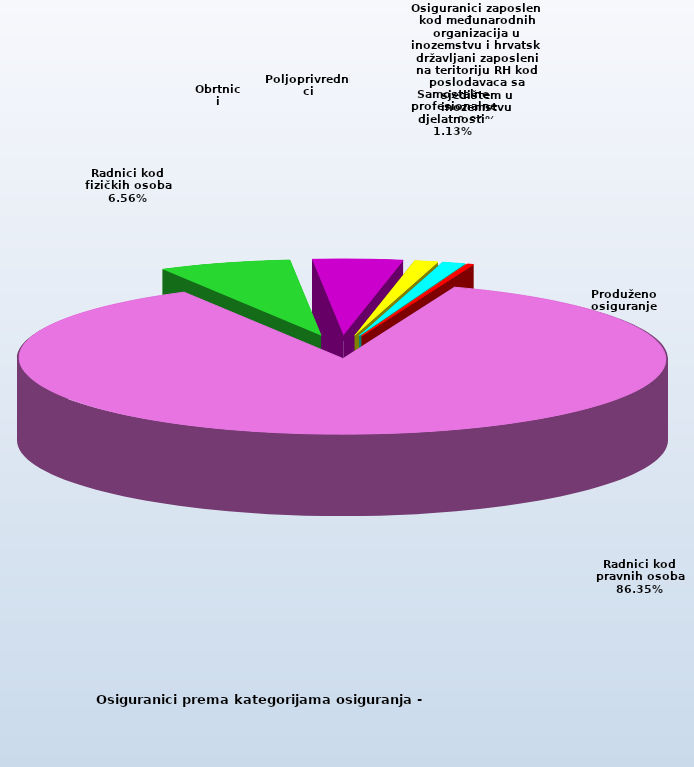
| Category | Series 0 |
|---|---|
| Radnici kod pravnih osoba | 1381245 |
| Radnici kod fizičkih osoba | 104935 |
| Obrtnici | 71474 |
| Poljoprivrednici | 18733 |
| Samostalne profesionalne djelatnosti  | 18115 |
| Osiguranici zaposleni kod međunarodnih organizacija u inozemstvu i hrvatski državljani zaposleni na teritoriju RH kod poslodavaca sa sjedištem u inozemstvu | 71 |
| Produženo osiguranje | 4937 |